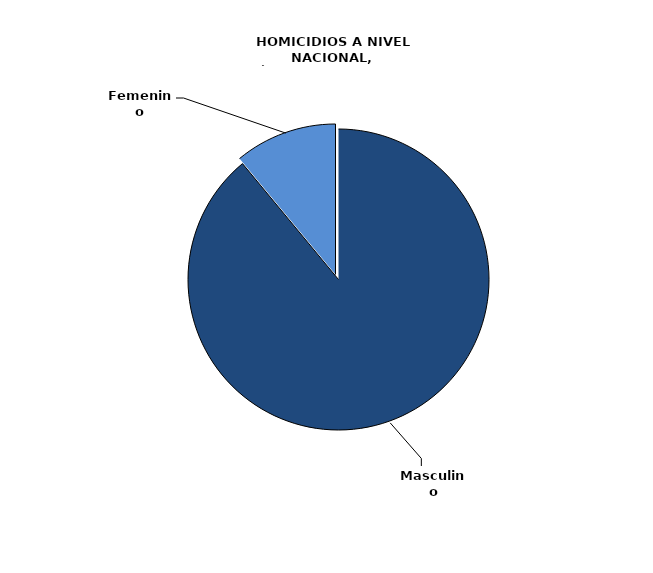
| Category | Masculino |
|---|---|
| Masculino | 493 |
| Femenino | 61 |